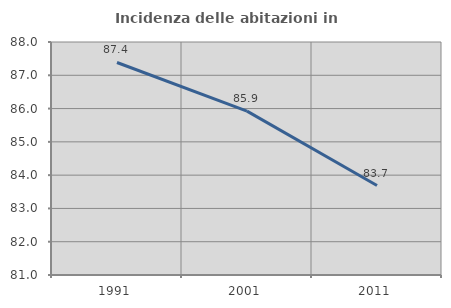
| Category | Incidenza delle abitazioni in proprietà  |
|---|---|
| 1991.0 | 87.384 |
| 2001.0 | 85.923 |
| 2011.0 | 83.687 |